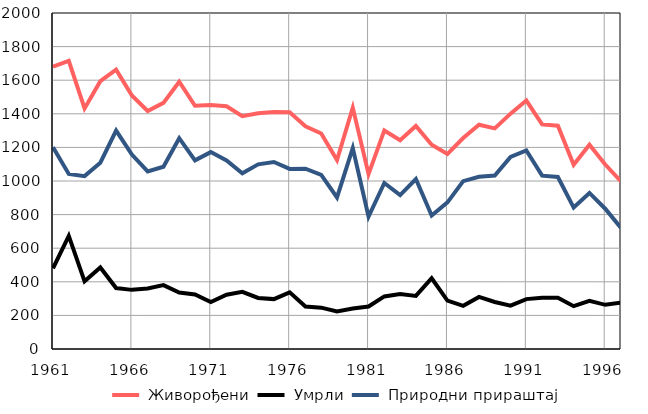
| Category |  Живорођени |  Умрли |  Природни прираштај |
|---|---|---|---|
| 1961.0 | 1681 | 480 | 1201 |
| 1962.0 | 1715 | 673 | 1042 |
| 1963.0 | 1432 | 403 | 1029 |
| 1964.0 | 1594 | 485 | 1109 |
| 1965.0 | 1663 | 363 | 1300 |
| 1966.0 | 1509 | 352 | 1157 |
| 1967.0 | 1417 | 360 | 1057 |
| 1968.0 | 1465 | 380 | 1085 |
| 1969.0 | 1591 | 336 | 1255 |
| 1970.0 | 1448 | 325 | 1123 |
| 1971.0 | 1452 | 280 | 1172 |
| 1972.0 | 1445 | 323 | 1122 |
| 1973.0 | 1386 | 340 | 1046 |
| 1974.0 | 1403 | 304 | 1099 |
| 1975.0 | 1410 | 297 | 1113 |
| 1976.0 | 1409 | 337 | 1072 |
| 1977.0 | 1326 | 253 | 1073 |
| 1978.0 | 1283 | 246 | 1037 |
| 1979.0 | 1125 | 223 | 902 |
| 1980.0 | 1437 | 241 | 1196 |
| 1981.0 | 1041 | 253 | 788 |
| 1982.0 | 1301 | 313 | 988 |
| 1983.0 | 1243 | 327 | 916 |
| 1984.0 | 1328 | 316 | 1012 |
| 1985.0 | 1216 | 421 | 795 |
| 1986.0 | 1161 | 288 | 873 |
| 1987.0 | 1256 | 257 | 999 |
| 1988.0 | 1335 | 310 | 1025 |
| 1989.0 | 1313 | 280 | 1033 |
| 1990.0 | 1401 | 258 | 1143 |
| 1991.0 | 1479 | 297 | 1182 |
| 1992.0 | 1337 | 305 | 1032 |
| 1993.0 | 1329 | 305 | 1024 |
| 1994.0 | 1097 | 255 | 842 |
| 1995.0 | 1216 | 287 | 929 |
| 1996.0 | 1098 | 263 | 835 |
| 1997.0 | 997 | 276 | 721 |